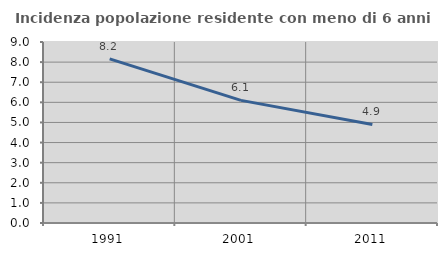
| Category | Incidenza popolazione residente con meno di 6 anni |
|---|---|
| 1991.0 | 8.158 |
| 2001.0 | 6.096 |
| 2011.0 | 4.902 |